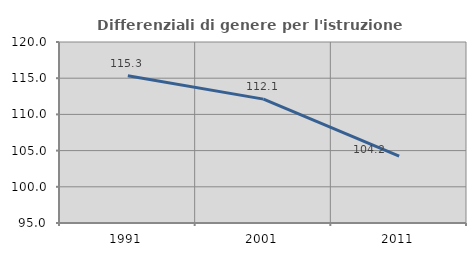
| Category | Differenziali di genere per l'istruzione superiore |
|---|---|
| 1991.0 | 115.327 |
| 2001.0 | 112.109 |
| 2011.0 | 104.228 |